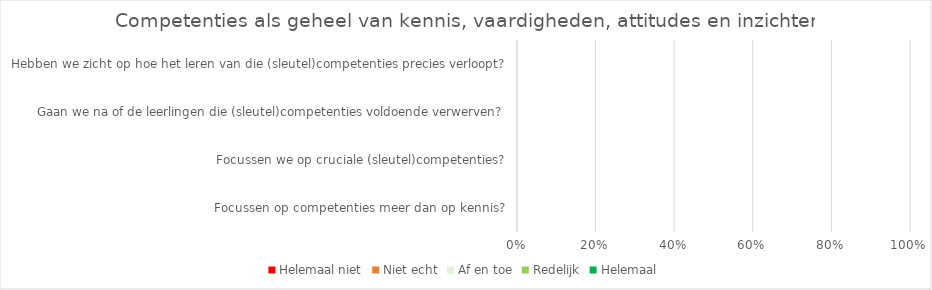
| Category | Helemaal niet | Niet echt | Af en toe | Redelijk | Helemaal |
|---|---|---|---|---|---|
| Focussen op competenties meer dan op kennis? | 0 | 0 | 0 | 0 | 0 |
| Focussen we op cruciale (sleutel)competenties? | 0 | 0 | 0 | 0 | 0 |
| Gaan we na of de leerlingen die (sleutel)competenties voldoende verwerven? | 0 | 0 | 0 | 0 | 0 |
| Hebben we zicht op hoe het leren van die (sleutel)competenties precies verloopt? | 0 | 0 | 0 | 0 | 0 |